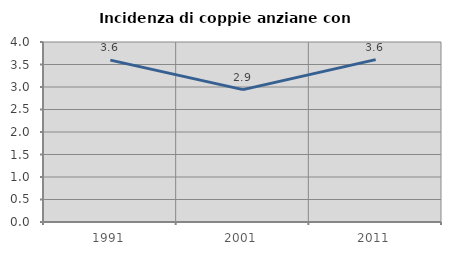
| Category | Incidenza di coppie anziane con figli |
|---|---|
| 1991.0 | 3.597 |
| 2001.0 | 2.941 |
| 2011.0 | 3.608 |